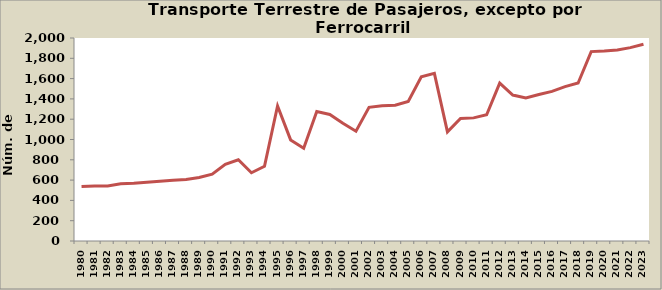
| Category | Series 0 |
|---|---|
| 1980.0 | 537 |
| 1981.0 | 543 |
| 1982.0 | 541 |
| 1983.0 | 563 |
| 1984.0 | 568 |
| 1985.0 | 579 |
| 1986.0 | 589 |
| 1987.0 | 599 |
| 1988.0 | 607 |
| 1989.0 | 625 |
| 1990.0 | 658 |
| 1991.0 | 755 |
| 1992.0 | 800 |
| 1993.0 | 672 |
| 1994.0 | 736 |
| 1995.0 | 1331 |
| 1996.0 | 996 |
| 1997.0 | 914 |
| 1998.0 | 1275 |
| 1999.0 | 1247 |
| 2000.0 | 1161 |
| 2001.0 | 1082 |
| 2002.0 | 1317 |
| 2003.0 | 1333 |
| 2004.0 | 1337 |
| 2005.0 | 1375 |
| 2006.0 | 1617 |
| 2007.0 | 1652 |
| 2008.0 | 1075 |
| 2009.0 | 1207 |
| 2010.0 | 1213 |
| 2011.0 | 1243 |
| 2012.0 | 1556 |
| 2013.0 | 1438 |
| 2014.0 | 1409 |
| 2015.0 | 1443 |
| 2016.0 | 1474 |
| 2017.0 | 1521 |
| 2018.0 | 1557 |
| 2019.0 | 1866 |
| 2020.0 | 1871 |
| 2021.0 | 1882 |
| 2022.0 | 1905 |
| 2023.0 | 1939 |